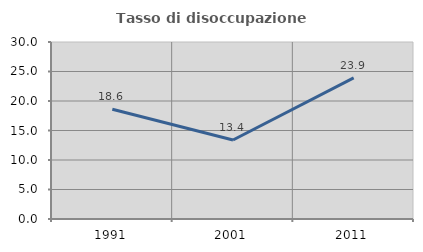
| Category | Tasso di disoccupazione giovanile  |
|---|---|
| 1991.0 | 18.605 |
| 2001.0 | 13.393 |
| 2011.0 | 23.913 |